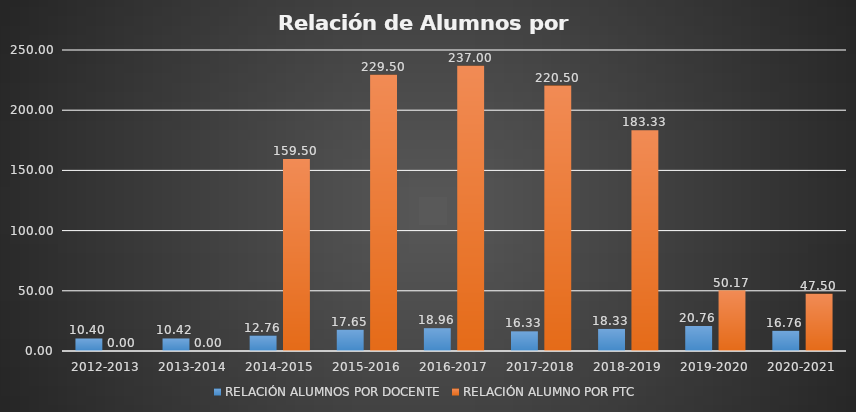
| Category | RELACIÓN ALUMNOS POR DOCENTE | RELACIÓN ALUMNO POR PTC |
|---|---|---|
| 2012-2013 | 10.4 | 0 |
| 2013-2014 | 10.421 | 0 |
| 2014-2015 | 12.76 | 159.5 |
| 2015-2016 | 17.654 | 229.5 |
| 2016-2017 | 18.96 | 237 |
| 2017-2018 | 16.333 | 220.5 |
| 2018-2019 | 18.333 | 183.333 |
| 2019-2020 | 20.759 | 50.167 |
| 2020-2021 | 16.765 | 47.5 |